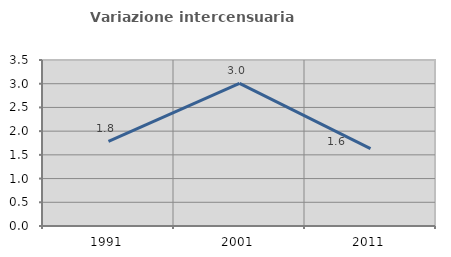
| Category | Variazione intercensuaria annua |
|---|---|
| 1991.0 | 1.787 |
| 2001.0 | 3.008 |
| 2011.0 | 1.629 |